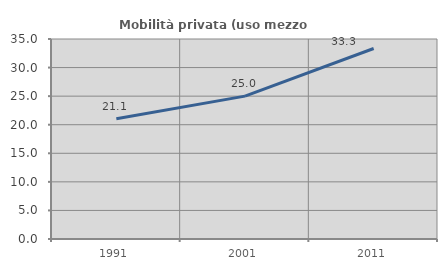
| Category | Mobilità privata (uso mezzo privato) |
|---|---|
| 1991.0 | 21.053 |
| 2001.0 | 25 |
| 2011.0 | 33.333 |